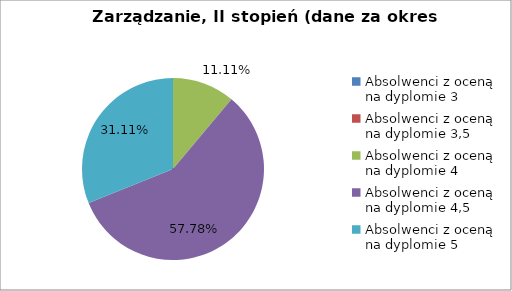
| Category | Series 0 |
|---|---|
| Absolwenci z oceną na dyplomie 3 | 0 |
| Absolwenci z oceną na dyplomie 3,5 | 0 |
| Absolwenci z oceną na dyplomie 4 | 11.111 |
| Absolwenci z oceną na dyplomie 4,5 | 57.778 |
| Absolwenci z oceną na dyplomie 5 | 31.111 |